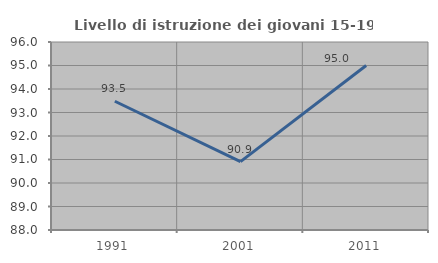
| Category | Livello di istruzione dei giovani 15-19 anni |
|---|---|
| 1991.0 | 93.478 |
| 2001.0 | 90.909 |
| 2011.0 | 95 |